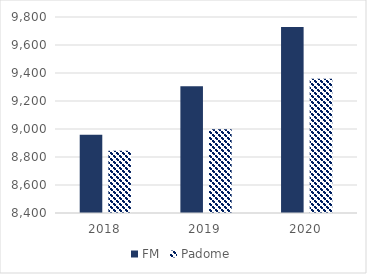
| Category | FM | Padome |
|---|---|---|
| 2018.0 | 8958.114 | 8844.676 |
| 2019.0 | 9305.962 | 8998.332 |
| 2020.0 | 9728.697 | 9359.657 |